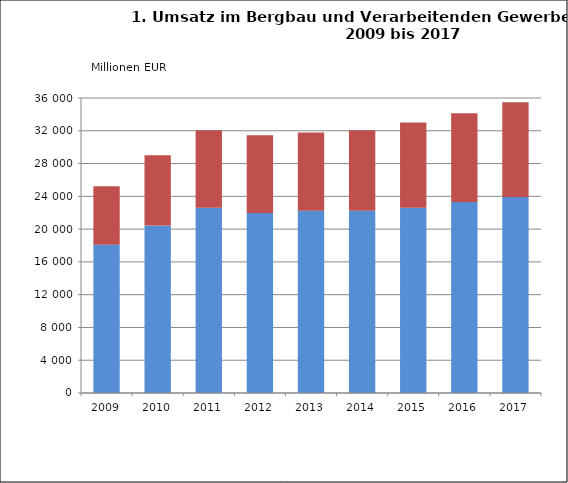
| Category | Inland umsatz | Ausland umsatz |
|---|---|---|
| 2009.0 | 18103.931 | 7111.569 |
| 2010.0 | 20440.329 | 8560.204 |
| 2011.0 | 22606.685 | 9451.682 |
| 2012.0 | 21971.623 | 9490.007 |
| 2013.0 | 22235.95 | 9555.079 |
| 2014.0 | 22238.159 | 9816.082 |
| 2015.0 | 22613.676 | 10383.052 |
| 2016.0 | 23301.648 | 10851.594 |
| 2017.0 | 23932.875 | 11547.301 |